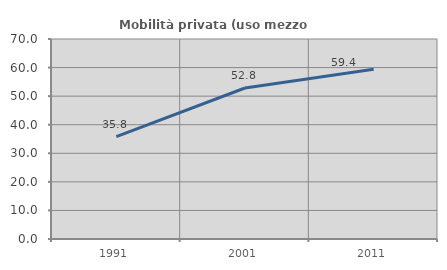
| Category | Mobilità privata (uso mezzo privato) |
|---|---|
| 1991.0 | 35.808 |
| 2001.0 | 52.841 |
| 2011.0 | 59.375 |